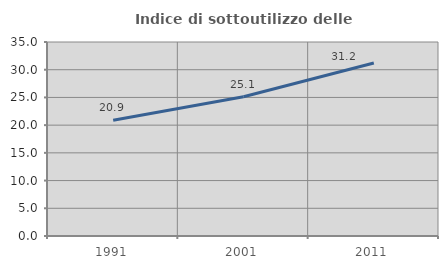
| Category | Indice di sottoutilizzo delle abitazioni  |
|---|---|
| 1991.0 | 20.866 |
| 2001.0 | 25.133 |
| 2011.0 | 31.199 |